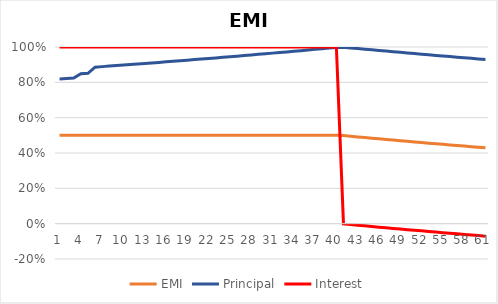
| Category | EMI | Principal | Interest |
|---|---|---|---|
| 0 | 10379.178 | 6629.178 | 3750 |
| 1 | 10379.178 | 6678.896 | 3700.281 |
| 2 | 10379.178 | 6728.988 | 3650.189 |
| 3 | 10379.178 | 7229.456 | 3149.722 |
| 4 | 10379.178 | 7283.676 | 3095.501 |
| 5 | 10379.178 | 8013.304 | 2365.874 |
| 6 | 10379.178 | 8073.404 | 2305.774 |
| 7 | 10379.178 | 8133.954 | 2245.223 |
| 8 | 10379.178 | 8194.959 | 2184.219 |
| 9 | 10379.178 | 8256.421 | 2122.756 |
| 10 | 10379.178 | 8318.344 | 2060.833 |
| 11 | 10379.178 | 8380.732 | 1998.446 |
| 12 | 10379.178 | 8443.587 | 1935.59 |
| 13 | 10379.178 | 8506.914 | 1872.263 |
| 14 | 10379.178 | 8570.716 | 1808.461 |
| 15 | 10379.178 | 8634.997 | 1744.181 |
| 16 | 10379.178 | 8699.759 | 1679.419 |
| 17 | 10379.178 | 8765.007 | 1614.17 |
| 18 | 10379.178 | 8830.745 | 1548.433 |
| 19 | 10379.178 | 8896.975 | 1482.202 |
| 20 | 10379.178 | 8963.703 | 1415.475 |
| 21 | 10379.178 | 9030.93 | 1348.247 |
| 22 | 10379.178 | 9098.662 | 1280.515 |
| 23 | 10379.178 | 9166.902 | 1212.275 |
| 24 | 10379.178 | 9235.654 | 1143.523 |
| 25 | 10379.178 | 9304.922 | 1074.256 |
| 26 | 10379.178 | 9374.709 | 1004.469 |
| 27 | 10379.178 | 9445.019 | 934.159 |
| 28 | 10379.178 | 9515.856 | 863.321 |
| 29 | 10379.178 | 9587.225 | 791.952 |
| 30 | 10379.178 | 9659.13 | 720.048 |
| 31 | 10379.178 | 9731.573 | 647.605 |
| 32 | 10379.178 | 9804.56 | 574.618 |
| 33 | 10379.178 | 9878.094 | 501.084 |
| 34 | 10379.178 | 9952.18 | 426.998 |
| 35 | 10379.178 | 10026.821 | 352.356 |
| 36 | 10379.178 | 10102.022 | 277.155 |
| 37 | 10379.178 | 10177.787 | 201.39 |
| 38 | 10379.178 | 10254.121 | 125.057 |
| 39 | 10379.178 | 10331.027 | 48.151 |
| 40 | 10379.178 | 10408.509 | -29.332 |
| 41 | 10379.178 | 10486.573 | -107.396 |
| 42 | 10379.178 | 10565.223 | -186.045 |
| 43 | 10379.178 | 10644.462 | -265.284 |
| 44 | 10379.178 | 10724.295 | -345.118 |
| 45 | 10379.178 | 10804.727 | -425.55 |
| 46 | 10379.178 | 10885.763 | -506.585 |
| 47 | 10379.178 | 10967.406 | -588.228 |
| 48 | 10379.178 | 11049.662 | -670.484 |
| 49 | 10379.178 | 11132.534 | -753.356 |
| 50 | 10379.178 | 11216.028 | -836.851 |
| 51 | 10379.178 | 11300.148 | -920.971 |
| 52 | 10379.178 | 11384.899 | -1005.722 |
| 53 | 10379.178 | 11470.286 | -1091.109 |
| 54 | 10379.178 | 11556.313 | -1177.136 |
| 55 | 10379.178 | 11642.986 | -1263.808 |
| 56 | 10379.178 | 11730.308 | -1351.13 |
| 57 | 10379.178 | 11818.285 | -1439.108 |
| 58 | 10379.178 | 11906.923 | -1527.745 |
| 59 | 10379.178 | 11996.224 | -1617.047 |
| 60 | 10379.178 | 12086.196 | -1707.019 |